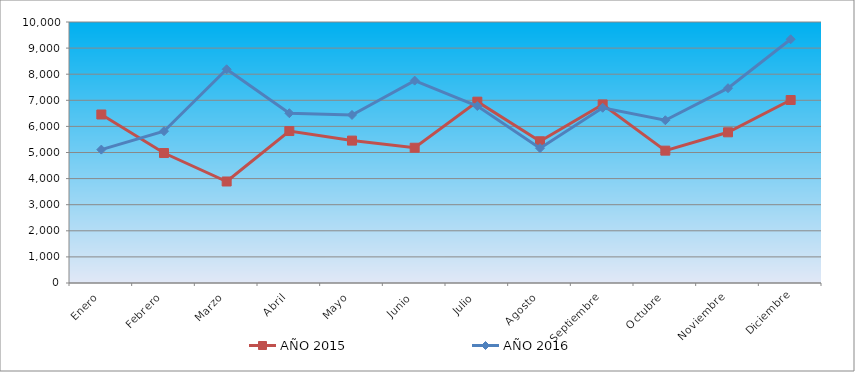
| Category | AÑO 2015 | AÑO 2016 |
|---|---|---|
| Enero | 6456 | 5111 |
| Febrero | 4980 | 5816 |
| Marzo | 3889 | 8188 |
| Abril | 5822 | 6506 |
| Mayo | 5456 | 6439 |
| Junio | 5182 | 7754 |
| Julio | 6948 | 6780 |
| Agosto | 5430 | 5166 |
| Septiembre | 6842 | 6715 |
| Octubre | 5071 | 6236 |
| Noviembre | 5774 | 7464 |
| Diciembre | 7011 | 9339 |